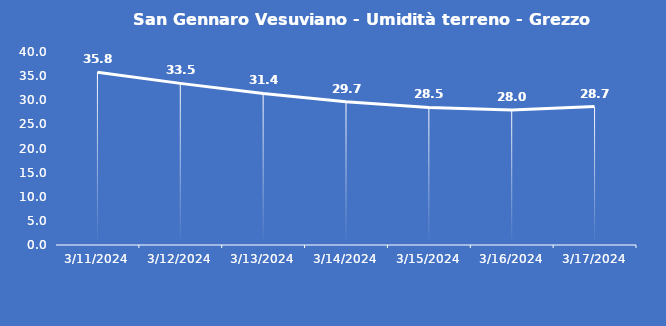
| Category | San Gennaro Vesuviano - Umidità terreno - Grezzo (%VWC) |
|---|---|
| 3/11/24 | 35.8 |
| 3/12/24 | 33.5 |
| 3/13/24 | 31.4 |
| 3/14/24 | 29.7 |
| 3/15/24 | 28.5 |
| 3/16/24 | 28 |
| 3/17/24 | 28.7 |